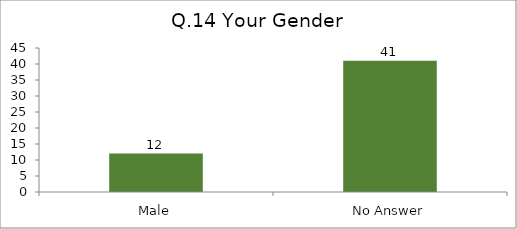
| Category | Q.14 Your Gender |
|---|---|
| Male | 12 |
| No Answer | 41 |